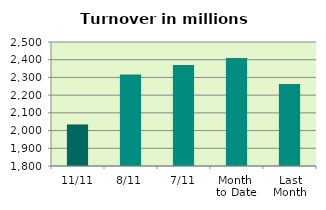
| Category | Series 0 |
|---|---|
| 11/11 | 2034.567 |
| 8/11 | 2316.678 |
| 7/11 | 2370.461 |
| Month 
to Date | 2408.996 |
| Last
Month | 2263.558 |